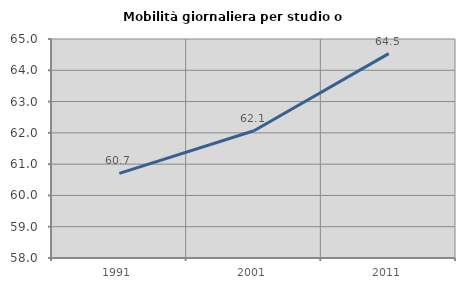
| Category | Mobilità giornaliera per studio o lavoro |
|---|---|
| 1991.0 | 60.703 |
| 2001.0 | 62.068 |
| 2011.0 | 64.531 |